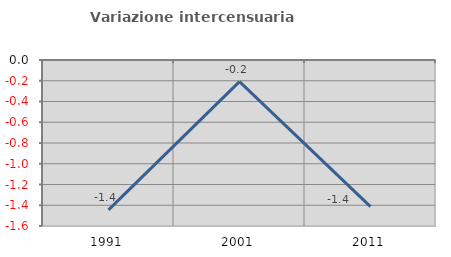
| Category | Variazione intercensuaria annua |
|---|---|
| 1991.0 | -1.445 |
| 2001.0 | -0.208 |
| 2011.0 | -1.413 |